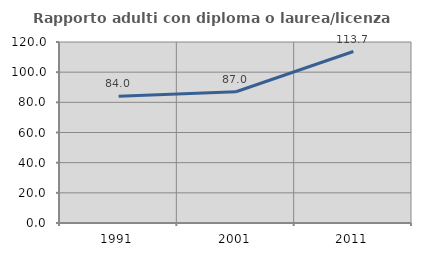
| Category | Rapporto adulti con diploma o laurea/licenza media  |
|---|---|
| 1991.0 | 83.981 |
| 2001.0 | 87.045 |
| 2011.0 | 113.679 |